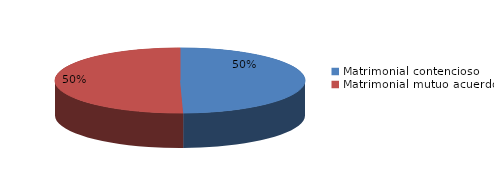
| Category | Series 0 |
|---|---|
| 0 | 187 |
| 1 | 190 |